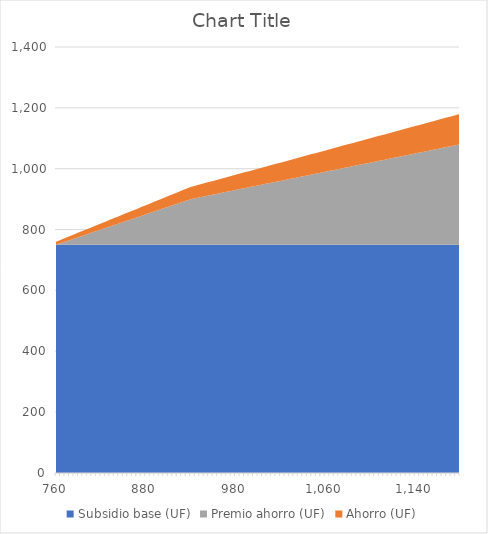
| Category | Subsidio base (UF) | Premio ahorro (UF) | Ahorro (UF) |
|---|---|---|---|
| 760.0 | 750 | 0 | 10 |
| 766.0 | 750 | 5 | 11 |
| 772.0 | 750 | 10 | 12 |
| 778.0 | 750 | 15 | 13 |
| 784.0 | 750 | 20 | 14 |
| 790.0 | 750 | 25 | 15 |
| 796.0 | 750 | 30 | 16 |
| 802.0 | 750 | 35 | 17 |
| 808.0 | 750 | 40 | 18 |
| 814.0 | 750 | 45 | 19 |
| 820.0 | 750 | 50 | 20 |
| 826.0 | 750 | 55 | 21 |
| 832.0 | 750 | 60 | 22 |
| 838.0 | 750 | 65 | 23 |
| 844.0 | 750 | 70 | 24 |
| 850.0 | 750 | 75 | 25 |
| 856.0 | 750 | 80 | 26 |
| 862.0 | 750 | 85 | 27 |
| 868.0 | 750 | 90 | 28 |
| 874.0 | 750 | 95 | 29 |
| 880.0 | 750 | 100 | 30 |
| 886.0 | 750 | 105 | 31 |
| 892.0 | 750 | 110 | 32 |
| 898.0 | 750 | 115 | 33 |
| 904.0 | 750 | 120 | 34 |
| 910.0 | 750 | 125 | 35 |
| 916.0 | 750 | 130 | 36 |
| 922.0 | 750 | 135 | 37 |
| 928.0 | 750 | 140 | 38 |
| 934.0 | 750 | 145 | 39 |
| 940.0 | 750 | 150 | 40 |
| 944.0 | 750 | 153 | 41 |
| 948.0 | 750 | 156 | 42 |
| 952.0 | 750 | 159 | 43 |
| 956.0 | 750 | 162 | 44 |
| 960.0 | 750 | 165 | 45 |
| 964.0 | 750 | 168 | 46 |
| 968.0 | 750 | 171 | 47 |
| 972.0 | 750 | 174 | 48 |
| 976.0 | 750 | 177 | 49 |
| 980.0 | 750 | 180 | 50 |
| 984.0 | 750 | 183 | 51 |
| 988.0 | 750 | 186 | 52 |
| 992.0 | 750 | 189 | 53 |
| 996.0 | 750 | 192 | 54 |
| 1000.0 | 750 | 195 | 55 |
| 1004.0 | 750 | 198 | 56 |
| 1008.0 | 750 | 201 | 57 |
| 1012.0 | 750 | 204 | 58 |
| 1016.0 | 750 | 207 | 59 |
| 1020.0 | 750 | 210 | 60 |
| 1024.0 | 750 | 213 | 61 |
| 1028.0 | 750 | 216 | 62 |
| 1032.0 | 750 | 219 | 63 |
| 1036.0 | 750 | 222 | 64 |
| 1040.0 | 750 | 225 | 65 |
| 1044.0 | 750 | 228 | 66 |
| 1048.0 | 750 | 231 | 67 |
| 1052.0 | 750 | 234 | 68 |
| 1056.0 | 750 | 237 | 69 |
| 1060.0 | 750 | 240 | 70 |
| 1064.0 | 750 | 243 | 71 |
| 1068.0 | 750 | 246 | 72 |
| 1072.0 | 750 | 249 | 73 |
| 1076.0 | 750 | 252 | 74 |
| 1080.0 | 750 | 255 | 75 |
| 1084.0 | 750 | 258 | 76 |
| 1088.0 | 750 | 261 | 77 |
| 1092.0 | 750 | 264 | 78 |
| 1096.0 | 750 | 267 | 79 |
| 1100.0 | 750 | 270 | 80 |
| 1104.0 | 750 | 273 | 81 |
| 1108.0 | 750 | 276 | 82 |
| 1112.0 | 750 | 279 | 83 |
| 1116.0 | 750 | 282 | 84 |
| 1120.0 | 750 | 285 | 85 |
| 1124.0 | 750 | 288 | 86 |
| 1128.0 | 750 | 291 | 87 |
| 1132.0 | 750 | 294 | 88 |
| 1136.0 | 750 | 297 | 89 |
| 1140.0 | 750 | 300 | 90 |
| 1144.0 | 750 | 303 | 91 |
| 1148.0 | 750 | 306 | 92 |
| 1152.0 | 750 | 309 | 93 |
| 1156.0 | 750 | 312 | 94 |
| 1160.0 | 750 | 315 | 95 |
| 1164.0 | 750 | 318 | 96 |
| 1168.0 | 750 | 321 | 97 |
| 1172.0 | 750 | 324 | 98 |
| 1176.0 | 750 | 327 | 99 |
| 1180.0 | 750 | 330 | 100 |